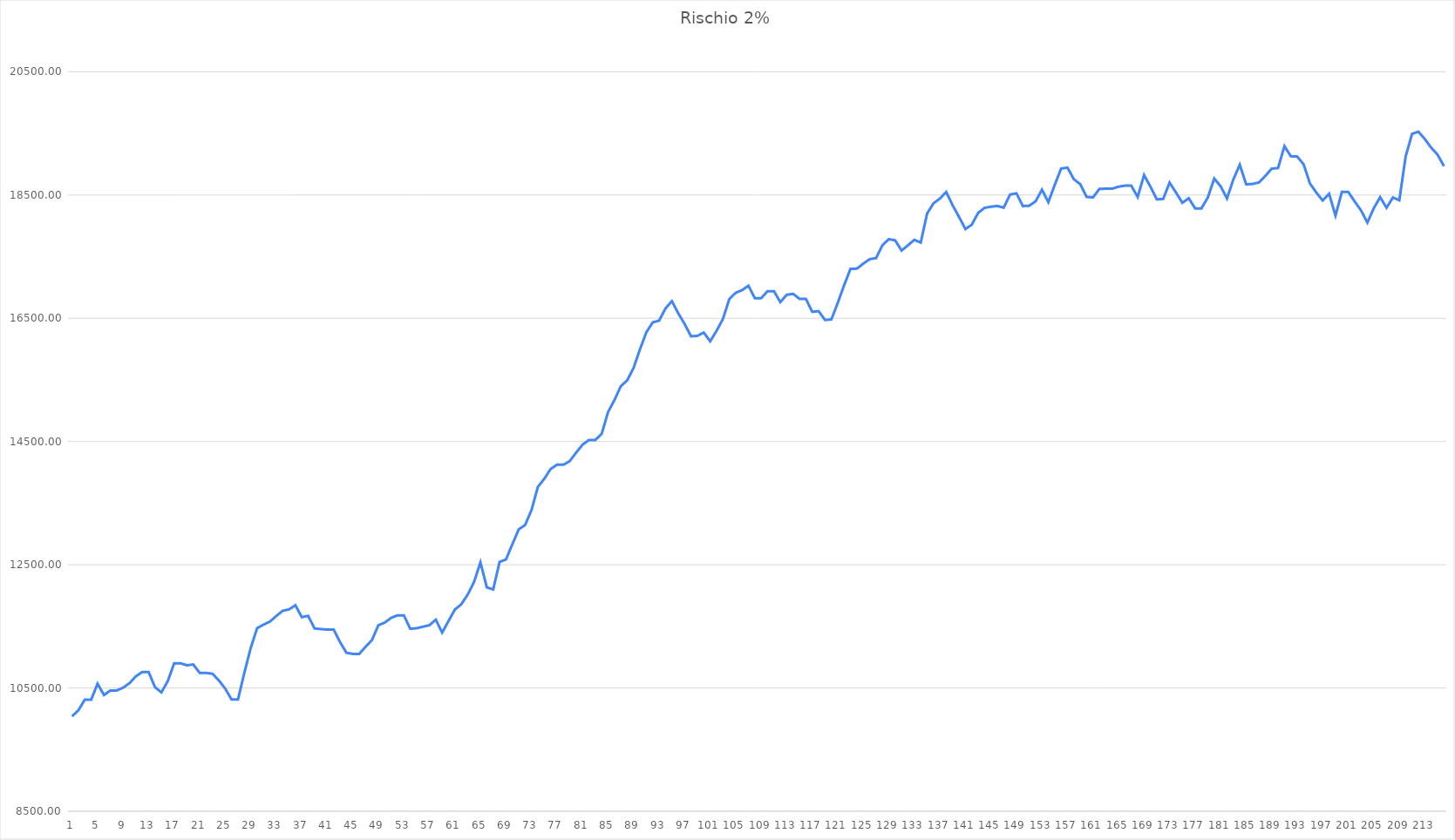
| Category | Series 0 |
|---|---|
| 0 | 10040 |
| 1 | 10138.56 |
| 2 | 10311.04 |
| 3 | 10311.04 |
| 4 | 10570 |
| 5 | 10385.68 |
| 6 | 10460.08 |
| 7 | 10460.08 |
| 8 | 10504.88 |
| 9 | 10577.84 |
| 10 | 10690.04 |
| 11 | 10759.48 |
| 12 | 10759.48 |
| 13 | 10512.184 |
| 14 | 10428.464 |
| 15 | 10611.984 |
| 16 | 10900.824 |
| 17 | 10900.824 |
| 18 | 10868.824 |
| 19 | 10881.624 |
| 20 | 10744.984 |
| 21 | 10744.984 |
| 22 | 10731.864 |
| 23 | 10623.984 |
| 24 | 10490.064 |
| 25 | 10312.144 |
| 26 | 10312.144 |
| 27 | 10747.344 |
| 28 | 11150.544 |
| 29 | 11470.544 |
| 30 | 11528.144 |
| 31 | 11577.104 |
| 32 | 11668.244 |
| 33 | 11751.944 |
| 34 | 11775.464 |
| 35 | 11843.168 |
| 36 | 11650.304 |
| 37 | 11670.784 |
| 38 | 11465.984 |
| 39 | 11456.384 |
| 40 | 11447.744 |
| 41 | 11447.744 |
| 42 | 11244.884 |
| 43 | 11072.244 |
| 44 | 11053.044 |
| 45 | 11053.044 |
| 46 | 11168.148 |
| 47 | 11278.02 |
| 48 | 11518.02 |
| 49 | 11561.22 |
| 50 | 11637.972 |
| 51 | 11679.312 |
| 52 | 11679.312 |
| 53 | 11461.712 |
| 54 | 11469.68 |
| 55 | 11494.64 |
| 56 | 11518.64 |
| 57 | 11608.64 |
| 58 | 11398.72 |
| 59 | 11588 |
| 60 | 11773.9 |
| 61 | 11857.9 |
| 62 | 12016.3 |
| 63 | 12220.3 |
| 64 | 12539.22 |
| 65 | 12132.52 |
| 66 | 12099.32 |
| 67 | 12545.54 |
| 68 | 12585.86 |
| 69 | 12832.42 |
| 70 | 13074.34 |
| 71 | 13144.9 |
| 72 | 13386.82 |
| 73 | 13763.14 |
| 74 | 13894.18 |
| 75 | 14053.924 |
| 76 | 14122.532 |
| 77 | 14122.532 |
| 78 | 14182.032 |
| 79 | 14320.072 |
| 80 | 14448.2 |
| 81 | 14524.312 |
| 82 | 14524.312 |
| 83 | 14624.008 |
| 84 | 14977.768 |
| 85 | 15172.328 |
| 86 | 15397.608 |
| 87 | 15492.648 |
| 88 | 15694.248 |
| 89 | 15996.648 |
| 90 | 16272.648 |
| 91 | 16433.128 |
| 92 | 16461.448 |
| 93 | 16659.448 |
| 94 | 16778.392 |
| 95 | 16580.792 |
| 96 | 16406.552 |
| 97 | 16207.352 |
| 98 | 16214.552 |
| 99 | 16267.672 |
| 100 | 16126.072 |
| 101 | 16295.992 |
| 102 | 16489.216 |
| 103 | 16810.816 |
| 104 | 16913.216 |
| 105 | 16956.224 |
| 106 | 17028.224 |
| 107 | 16826.672 |
| 108 | 16826.672 |
| 109 | 16939.372 |
| 110 | 16939.372 |
| 111 | 16762.252 |
| 112 | 16880.332 |
| 113 | 16896.652 |
| 114 | 16815.116 |
| 115 | 16815.116 |
| 116 | 16605.116 |
| 117 | 16614.836 |
| 118 | 16472.276 |
| 119 | 16481.024 |
| 120 | 16749.824 |
| 121 | 17037.924 |
| 122 | 17302.524 |
| 123 | 17304.7 |
| 124 | 17386.572 |
| 125 | 17459.148 |
| 126 | 17475.852 |
| 127 | 17685.516 |
| 128 | 17782.956 |
| 129 | 17764.076 |
| 130 | 17598.876 |
| 131 | 17684.892 |
| 132 | 17772.444 |
| 133 | 17728.224 |
| 134 | 18199.264 |
| 135 | 18364.864 |
| 136 | 18442.48 |
| 137 | 18548.74 |
| 138 | 18333.14 |
| 139 | 18144.38 |
| 140 | 17947.26 |
| 141 | 18018.54 |
| 142 | 18209.94 |
| 143 | 18291.56 |
| 144 | 18309.96 |
| 145 | 18322.94 |
| 146 | 18294.236 |
| 147 | 18507.176 |
| 148 | 18527.196 |
| 149 | 18321.116 |
| 150 | 18325.736 |
| 151 | 18396.772 |
| 152 | 18586.612 |
| 153 | 18384.256 |
| 154 | 18664.536 |
| 155 | 18929.416 |
| 156 | 18944.136 |
| 157 | 18755.976 |
| 158 | 18675.576 |
| 159 | 18469.496 |
| 160 | 18460.568 |
| 161 | 18599.168 |
| 162 | 18602.444 |
| 163 | 18602.444 |
| 164 | 18635.084 |
| 165 | 18651.404 |
| 166 | 18651.404 |
| 167 | 18467.444 |
| 168 | 18824.276 |
| 169 | 18634.964 |
| 170 | 18429.564 |
| 171 | 18435.884 |
| 172 | 18701.564 |
| 173 | 18540.656 |
| 174 | 18374.256 |
| 175 | 18447.456 |
| 176 | 18283.296 |
| 177 | 18283.296 |
| 178 | 18461.344 |
| 179 | 18767.364 |
| 180 | 18641.94 |
| 181 | 18443.7 |
| 182 | 18754.74 |
| 183 | 18991.54 |
| 184 | 18673.444 |
| 185 | 18679.396 |
| 186 | 18703.156 |
| 187 | 18808.668 |
| 188 | 18927.38 |
| 189 | 18937.64 |
| 190 | 19293.32 |
| 191 | 19128.808 |
| 192 | 19124.584 |
| 193 | 18998.584 |
| 194 | 18685.752 |
| 195 | 18539.952 |
| 196 | 18410.592 |
| 197 | 18520.392 |
| 198 | 18166.416 |
| 199 | 18550.056 |
| 200 | 18550.056 |
| 201 | 18396.136 |
| 202 | 18250.144 |
| 203 | 18053.152 |
| 204 | 18285.472 |
| 205 | 18465.54 |
| 206 | 18292.9 |
| 207 | 18459.94 |
| 208 | 18414.58 |
| 209 | 19127.44 |
| 210 | 19492.144 |
| 211 | 19527.472 |
| 212 | 19408.432 |
| 213 | 19267.632 |
| 214 | 19154.736 |
| 215 | 18967.472 |